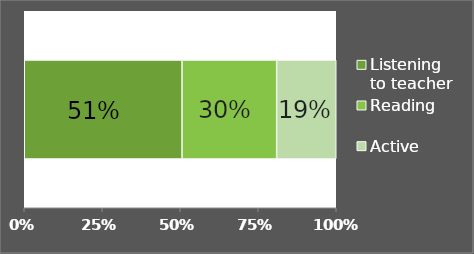
| Category | Listening to teacher | Reading | Active |
|---|---|---|---|
| 0 | 0.506 | 0.303 | 0.191 |